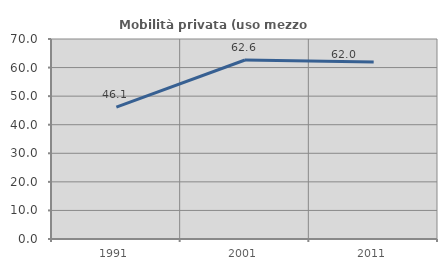
| Category | Mobilità privata (uso mezzo privato) |
|---|---|
| 1991.0 | 46.138 |
| 2001.0 | 62.646 |
| 2011.0 | 61.982 |